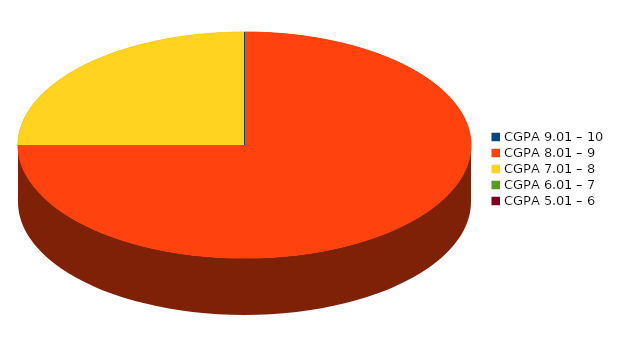
| Category | Number of students |
|---|---|
| CGPA 9.01 – 10 | 0 |
| CGPA 8.01 – 9 | 12 |
| CGPA 7.01 – 8 | 4 |
| CGPA 6.01 – 7 | 0 |
| CGPA 5.01 – 6 | 0 |